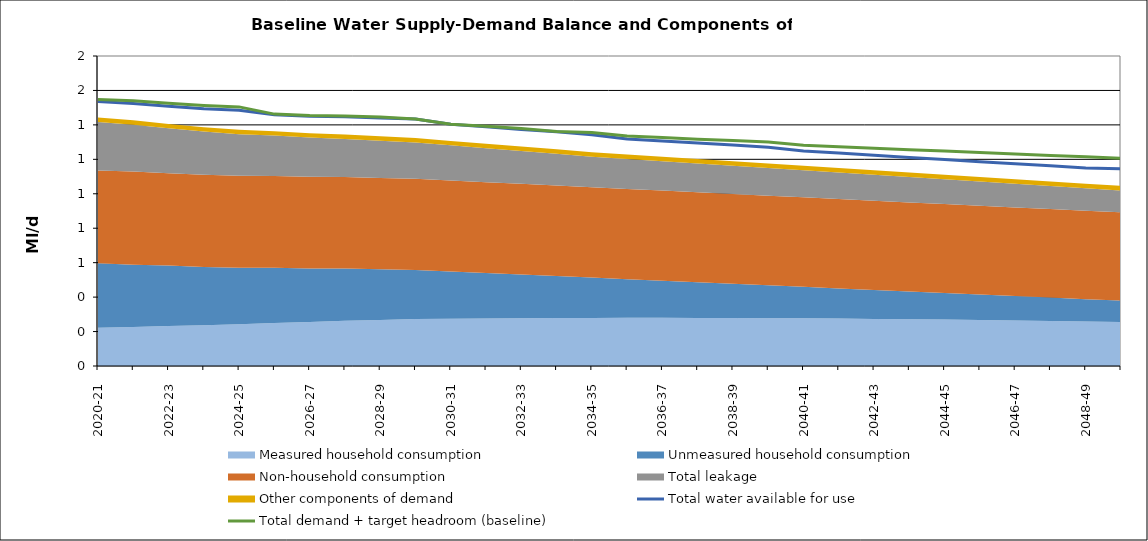
| Category | Total water available for use | Total demand + target headroom (baseline) |
|---|---|---|
| 2020-21 | 1.536 | 1.547 |
| 2021-22 | 1.524 | 1.54 |
| 2022-23 | 1.508 | 1.525 |
| 2023-24 | 1.493 | 1.513 |
| 2024-25 | 1.485 | 1.505 |
| 2025-26 | 1.459 | 1.463 |
| 2026-27 | 1.451 | 1.455 |
| 2027-28 | 1.448 | 1.452 |
| 2028-29 | 1.44 | 1.446 |
| 2029-30 | 1.434 | 1.434 |
| 2030-31 | 1.404 | 1.404 |
| 2031-32 | 1.389 | 1.392 |
| 2032-33 | 1.373 | 1.379 |
| 2033-34 | 1.359 | 1.362 |
| 2034-35 | 1.343 | 1.355 |
| 2035-36 | 1.318 | 1.335 |
| 2036-37 | 1.307 | 1.326 |
| 2037-38 | 1.295 | 1.317 |
| 2038-39 | 1.283 | 1.309 |
| 2039-40 | 1.27 | 1.301 |
| 2040-41 | 1.248 | 1.281 |
| 2041-42 | 1.236 | 1.273 |
| 2042-43 | 1.223 | 1.264 |
| 2043-44 | 1.211 | 1.256 |
| 2044-45 | 1.199 | 1.248 |
| 2045-46 | 1.186 | 1.239 |
| 2046-47 | 1.175 | 1.231 |
| 2047-48 | 1.163 | 1.223 |
| 2048-49 | 1.15 | 1.215 |
| 2049-50 | 1.145 | 1.206 |